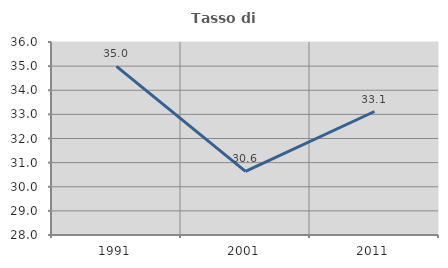
| Category | Tasso di occupazione   |
|---|---|
| 1991.0 | 34.986 |
| 2001.0 | 30.637 |
| 2011.0 | 33.119 |